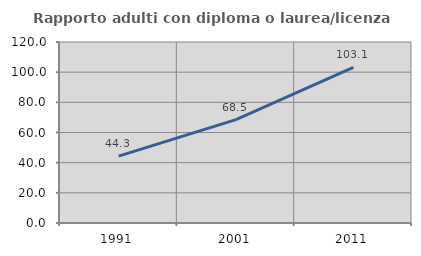
| Category | Rapporto adulti con diploma o laurea/licenza media  |
|---|---|
| 1991.0 | 44.337 |
| 2001.0 | 68.511 |
| 2011.0 | 103.145 |